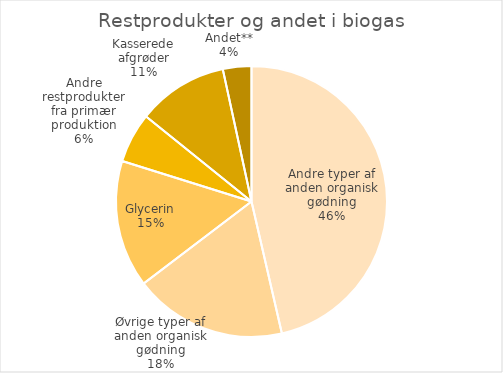
| Category | Series 0 |
|---|---|
| Andre typer af anden organisk gødning | 234285.03 |
| Øvrige typer af anden organisk gødning | 92146.48 |
| Glycerin | 76670.56 |
| Andre restprodukter fra primær produktion | 30136.92 |
| Kasserede afgrøder | 54523.36 |
| Andet** | 17187.39 |